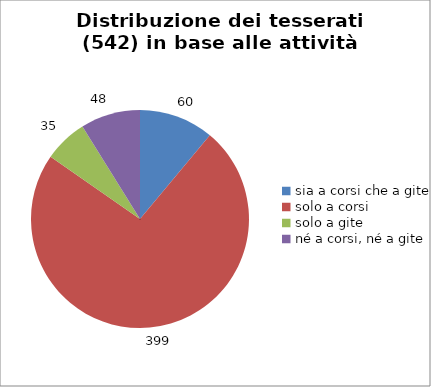
| Category | Nr. Tesserati |
|---|---|
| sia a corsi che a gite | 60 |
| solo a corsi | 399 |
| solo a gite | 35 |
| né a corsi, né a gite | 48 |